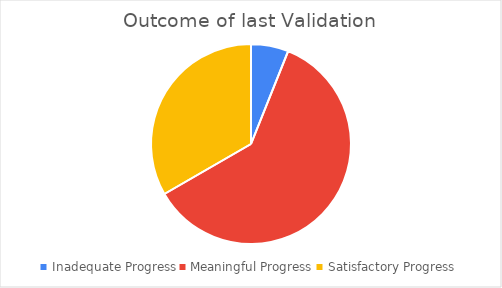
| Category | Series 0 |
|---|---|
| Inadequate Progress | 2 |
| Meaningful Progress | 20 |
| Satisfactory Progress | 11 |